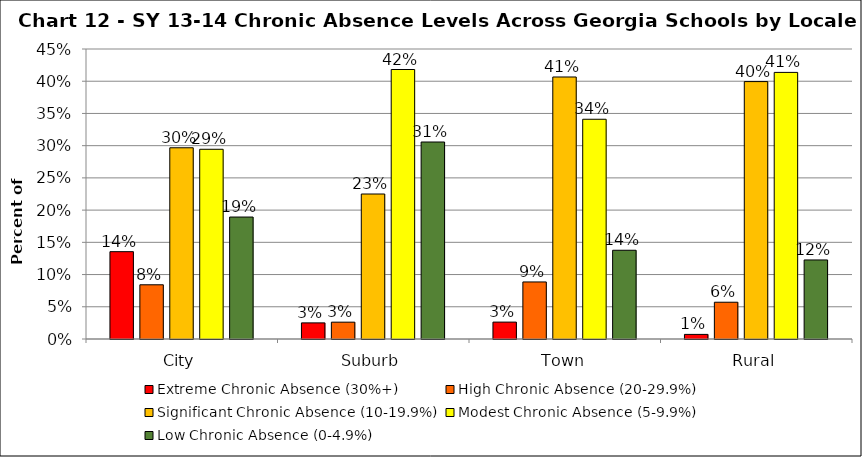
| Category | Extreme Chronic Absence (30%+) | High Chronic Absence (20-29.9%) | Significant Chronic Absence (10-19.9%) | Modest Chronic Absence (5-9.9%) | Low Chronic Absence (0-4.9%) |
|---|---|---|---|---|---|
| 0 | 0.136 | 0.084 | 0.297 | 0.294 | 0.189 |
| 1 | 0.025 | 0.026 | 0.225 | 0.418 | 0.306 |
| 2 | 0.026 | 0.089 | 0.407 | 0.341 | 0.138 |
| 3 | 0.007 | 0.057 | 0.399 | 0.414 | 0.123 |